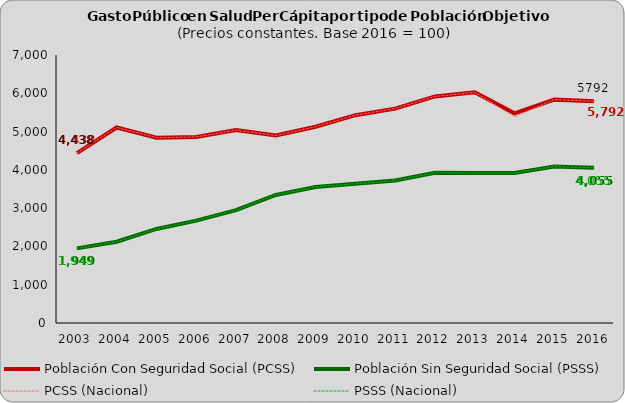
| Category | Población Con Seguridad Social (PCSS) | Población Sin Seguridad Social (PSSS) | PCSS (Nacional) | PSSS (Nacional) |
|---|---|---|---|---|
| 2003.0 | 4437.756 | 1949.283 | 4437.756 | 1949.283 |
| 2004.0 | 5106.924 | 2121.61 | 5106.924 | 2121.61 |
| 2005.0 | 4840.405 | 2456.912 | 4840.405 | 2456.912 |
| 2006.0 | 4860.018 | 2673.132 | 4860.018 | 2673.132 |
| 2007.0 | 5037.711 | 2949.958 | 5037.711 | 2949.958 |
| 2008.0 | 4895.688 | 3345.223 | 4895.688 | 3345.223 |
| 2009.0 | 5125.553 | 3553.315 | 5125.553 | 3553.315 |
| 2010.0 | 5427.921 | 3634.49 | 5427.921 | 3634.49 |
| 2011.0 | 5599.758 | 3723.157 | 5599.758 | 3723.157 |
| 2012.0 | 5917.214 | 3924.198 | 5917.214 | 3924.198 |
| 2013.0 | 6025.463 | 3918.37 | 6025.463 | 3918.37 |
| 2014.0 | 5476.448 | 3916.117 | 5387.356 | 3916 |
| 2015.0 | 5834.341 | 4087.83 | 5834.341 | 4087.83 |
| 2016.0 | 5792.48 | 4054.95 | 5792.48 | 4054.95 |